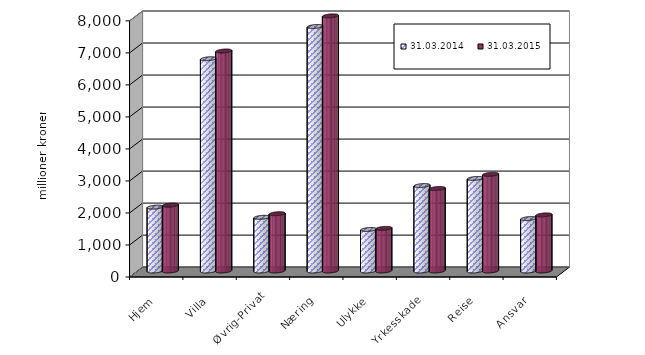
| Category | 31.03.2014 | 31.03.2015 |
|---|---|---|
| Hjem | 1995.718 | 2057.145 |
| Villa | 6629.55 | 6870.848 |
| Øvrig-Privat | 1676.82 | 1789.173 |
| Næring | 7638.127 | 7968.781 |
| Ulykke | 1296.679 | 1331.518 |
| Yrkesskade | 2669.472 | 2576.987 |
| Reise | 2891.519 | 3018.194 |
| Ansvar | 1637.616 | 1752.283 |